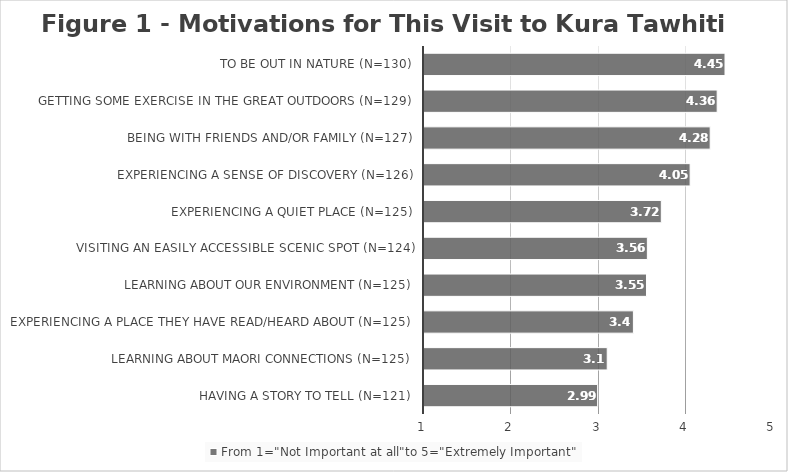
| Category | From 1="Not Important at all"to 5="Extremely Important" |
|---|---|
| Having a story to tell (N=121) | 2.99 |
| Learning about Maori connections (N=125) | 3.1 |
| Experiencing a place they have read/heard about (N=125) | 3.4 |
| Learning about our environment (N=125) | 3.55 |
| Visiting an easily accessible scenic spot (N=124) | 3.56 |
| Experiencing a quiet place (N=125) | 3.72 |
| Experiencing a sense of discovery (N=126) | 4.05 |
| Being with friends and‎/or family (N=127) | 4.28 |
| Getting some exercise in the great outdoors (N=129) | 4.36 |
| To be out in nature (N=130) | 4.45 |